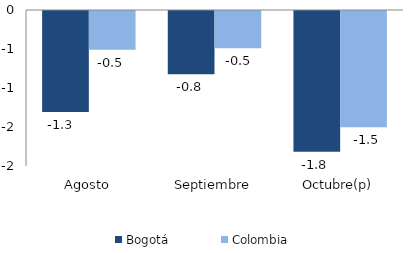
| Category | Bogotá | Colombia |
|---|---|---|
| Agosto | -1.296 | -0.496 |
| Septiembre | -0.81 | -0.479 |
| Octubre(p) | -1.805 | -1.491 |